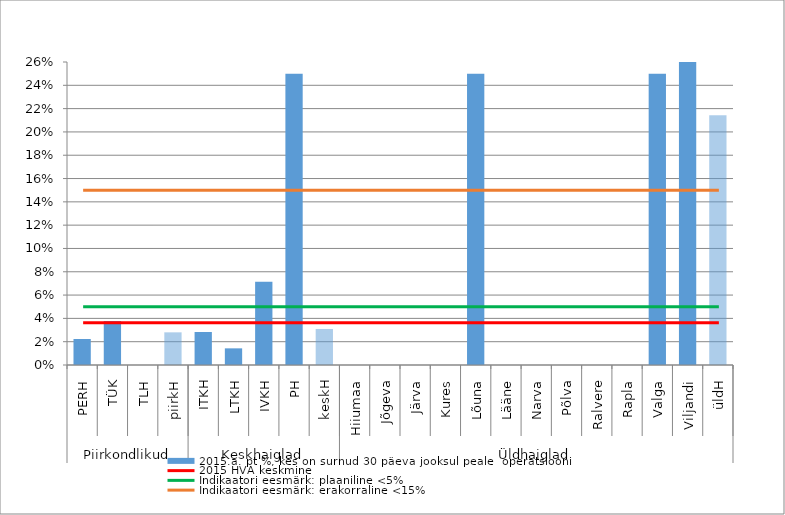
| Category | 2015.a. pt %, kes on surnud 30 päeva jooksul peale  operatsiooni |
|---|---|
| 0 | 0.022 |
| 1 | 0.038 |
| 2 | 0 |
| 3 | 0.028 |
| 4 | 0.028 |
| 5 | 0.014 |
| 6 | 0.071 |
| 7 | 0.25 |
| 8 | 0.031 |
| 9 | 0 |
| 10 | 0 |
| 11 | 0 |
| 12 | 0 |
| 13 | 0.25 |
| 14 | 0 |
| 15 | 0 |
| 16 | 0 |
| 17 | 0 |
| 18 | 0 |
| 19 | 0.25 |
| 20 | 0.5 |
| 21 | 0.214 |